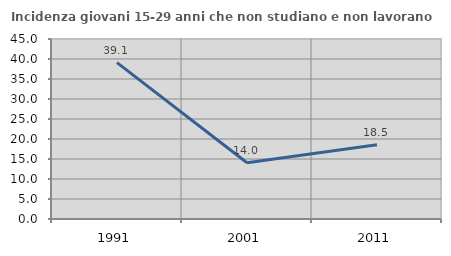
| Category | Incidenza giovani 15-29 anni che non studiano e non lavorano  |
|---|---|
| 1991.0 | 39.091 |
| 2001.0 | 14.048 |
| 2011.0 | 18.536 |